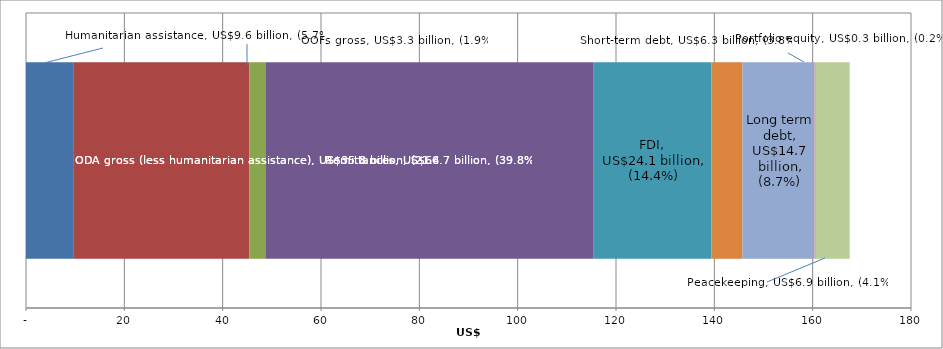
| Category | Humanitarian assistance, US$9.6 billion, (5.7%) | ODA gross (less humanitarian assistance), US$35.8 billion, (21.4%) | OOFs gross, US$3.3 billion, (1.9%) | Remittances, US$66.7 billion, (39.8%) | FDI, US$24.1 billion, (14.4%) | Short-term debt, US$6.3 billion, (3.8%) | Long-term debt, US$14.7 billion, (8.7%) | Portfolio equity, US$0.3 billion, (0.2%) | Peacekeeping, US$6.9 billion, (4.1%) |
|---|---|---|---|---|---|---|---|---|---|
| 0 | 9601.977 | 35829.135 | 3256.22 | 66658.077 | 24054.701 | 6306.706 | 14655.339 | 276.448 | 6883.5 |